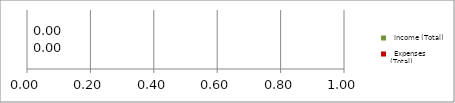
| Category |   Expenses (Total) |   Income (Total) |
|---|---|---|
| 0 | 0 | 0 |